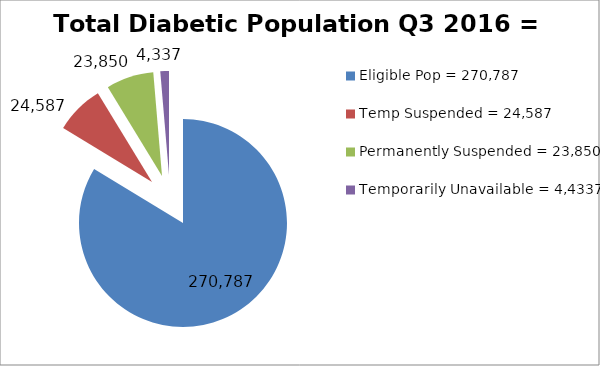
| Category | Total Diabetic Population Q3 2016 = 314,887 |
|---|---|
| Eligible Pop = 270,787 | 270787 |
| Temp Suspended = 24,587 | 24587 |
| Permanently Suspended = 23,850 | 23850 |
| Temporarily Unavailable = 4,4337 | 4337 |